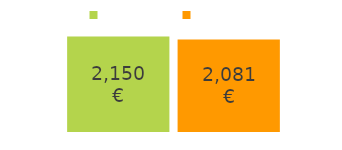
| Category | entrées | sorties |
|---|---|---|
| argent entrant : | 2150 | 2081 |